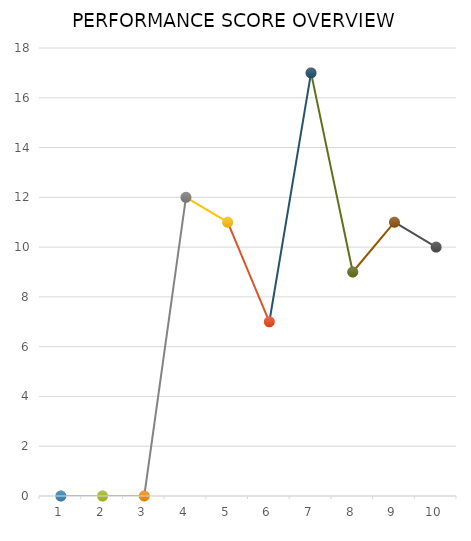
| Category | Series 0 |
|---|---|
| 1 | 0 |
| 2 | 0 |
| 3 | 0 |
| 4 | 12 |
| 5 | 11 |
| 6 | 7 |
| 7 | 17 |
| 8 | 9 |
| 9 | 11 |
| 10 | 10 |